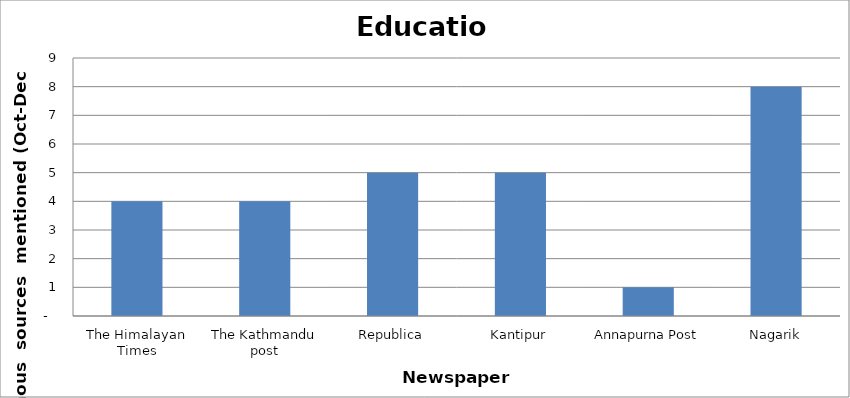
| Category | Education |
|---|---|
| The Himalayan Times | 4 |
| The Kathmandu post | 4 |
| Republica | 5 |
| Kantipur | 5 |
| Annapurna Post | 1 |
| Nagarik | 8 |